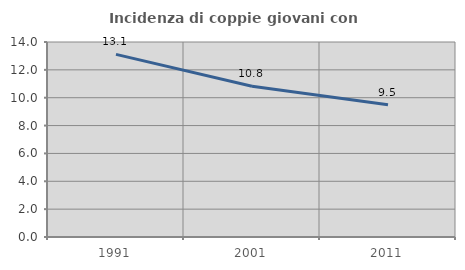
| Category | Incidenza di coppie giovani con figli |
|---|---|
| 1991.0 | 13.109 |
| 2001.0 | 10.826 |
| 2011.0 | 9.488 |